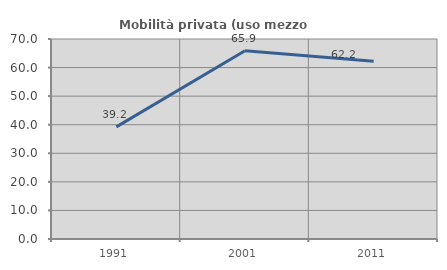
| Category | Mobilità privata (uso mezzo privato) |
|---|---|
| 1991.0 | 39.231 |
| 2001.0 | 65.882 |
| 2011.0 | 62.222 |